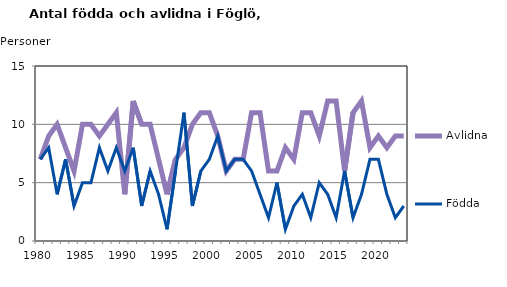
| Category | Avlidna | Födda |
|---|---|---|
| 1980.0 | 7 | 7 |
| 1981.0 | 9 | 8 |
| 1982.0 | 10 | 4 |
| 1983.0 | 8 | 7 |
| 1984.0 | 6 | 3 |
| 1985.0 | 10 | 5 |
| 1986.0 | 10 | 5 |
| 1987.0 | 9 | 8 |
| 1988.0 | 10 | 6 |
| 1989.0 | 11 | 8 |
| 1990.0 | 4 | 6 |
| 1991.0 | 12 | 8 |
| 1992.0 | 10 | 3 |
| 1993.0 | 10 | 6 |
| 1994.0 | 7 | 4 |
| 1995.0 | 4 | 1 |
| 1996.0 | 7 | 6 |
| 1997.0 | 8 | 11 |
| 1998.0 | 10 | 3 |
| 1999.0 | 11 | 6 |
| 2000.0 | 11 | 7 |
| 2001.0 | 9 | 9 |
| 2002.0 | 6 | 6 |
| 2003.0 | 7 | 7 |
| 2004.0 | 7 | 7 |
| 2005.0 | 11 | 6 |
| 2006.0 | 11 | 4 |
| 2007.0 | 6 | 2 |
| 2008.0 | 6 | 5 |
| 2009.0 | 8 | 1 |
| 2010.0 | 7 | 3 |
| 2011.0 | 11 | 4 |
| 2012.0 | 11 | 2 |
| 2013.0 | 9 | 5 |
| 2014.0 | 12 | 4 |
| 2015.0 | 12 | 2 |
| 2016.0 | 6 | 6 |
| 2017.0 | 11 | 2 |
| 2018.0 | 12 | 4 |
| 2019.0 | 8 | 7 |
| 2020.0 | 9 | 7 |
| 2021.0 | 8 | 4 |
| 2022.0 | 9 | 2 |
| 2023.0 | 9 | 3 |